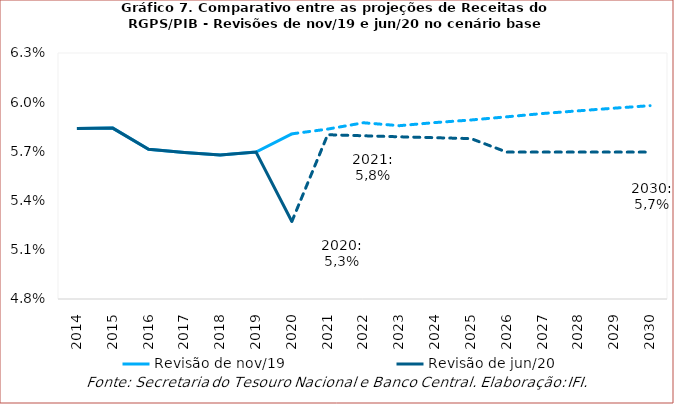
| Category | Revisão de nov/19 | Revisão de jun/20 |
|---|---|---|
| 2014.0 | 0.058 | 0.058 |
| 2015.0 | 0.058 | 0.058 |
| 2016.0 | 0.057 | 0.057 |
| 2017.0 | 0.057 | 0.057 |
| 2018.0 | 0.057 | 0.057 |
| 2019.0 | 0.057 | 0.057 |
| 2020.0 | 0.058 | 0.053 |
| 2021.0 | 0.058 | 0.058 |
| 2022.0 | 0.059 | 0.058 |
| 2023.0 | 0.059 | 0.058 |
| 2024.0 | 0.059 | 0.058 |
| 2025.0 | 0.059 | 0.058 |
| 2026.0 | 0.059 | 0.057 |
| 2027.0 | 0.059 | 0.057 |
| 2028.0 | 0.059 | 0.057 |
| 2029.0 | 0.06 | 0.057 |
| 2030.0 | 0.06 | 0.057 |